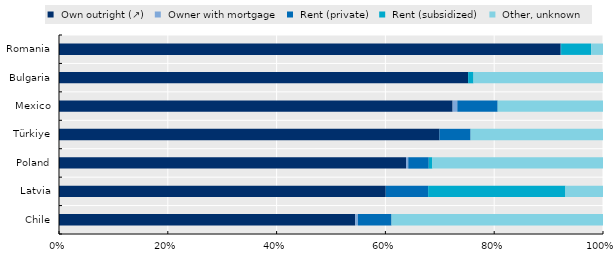
| Category | Series 0 | Series 1 | Series 2 | Series 3 | Series 4 |
|---|---|---|---|---|---|
| Chile | 0.544 | 0.005 | 0.062 | 0 | 0.389 |
| Latvia | 0.601 | 0 | 0.078 | 0.252 | 0.069 |
| Poland | 0.638 | 0.004 | 0.038 | 0.007 | 0.314 |
| Türkiye | 0.699 | 0 | 0.057 | 0 | 0.243 |
| Mexico | 0.724 | 0.009 | 0.074 | 0 | 0.194 |
| Bulgaria | 0.752 | 0 | 0 | 0.01 | 0.238 |
| Romania | 0.922 | 0 | 0.001 | 0.055 | 0.022 |